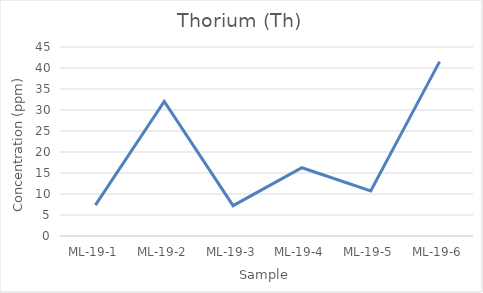
| Category | Thorium |
|---|---|
| ML-19-1 | 7.345 |
| ML-19-2 | 32.044 |
| ML-19-3 | 7.218 |
| ML-19-4 | 16.255 |
| ML-19-5 | 10.73 |
| ML-19-6 | 41.521 |